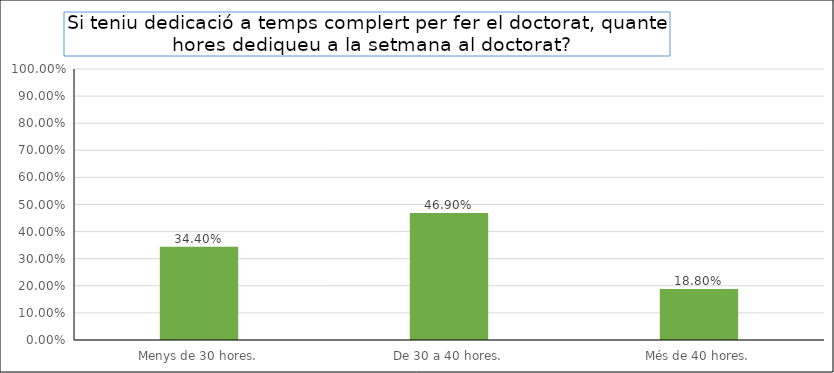
| Category | Series 0 |
|---|---|
| Menys de 30 hores. | 0.344 |
| De 30 a 40 hores. | 0.469 |
| Més de 40 hores. | 0.188 |